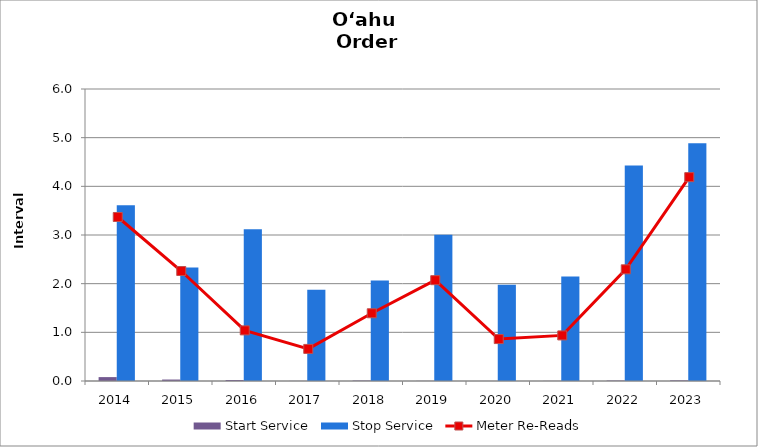
| Category | Start Service | Stop Service |
|---|---|---|
| 2014.0 | 0.08 | 3.611 |
| 2015.0 | 0.03 | 2.33 |
| 2016.0 | 0.02 | 3.12 |
| 2017.0 | 0.002 | 1.875 |
| 2018.0 | 0.009 | 2.065 |
| 2019.0 | 0.003 | 3.004 |
| 2020.0 | 0.001 | 1.98 |
| 2021.0 | 0.002 | 2.147 |
| 2022.0 | 0.009 | 4.43 |
| 2023.0 | 0.013 | 4.884 |